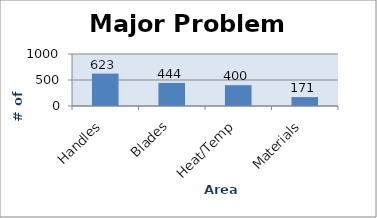
| Category | MPA |
|---|---|
| Handles | 623 |
| Blades | 444 |
| Heat/Temp | 400 |
| Materials | 171 |